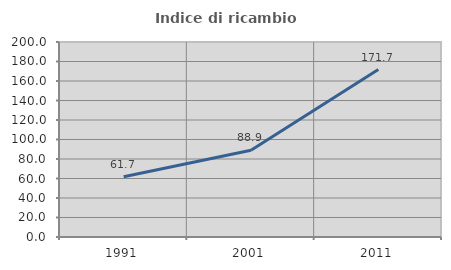
| Category | Indice di ricambio occupazionale  |
|---|---|
| 1991.0 | 61.749 |
| 2001.0 | 88.947 |
| 2011.0 | 171.698 |